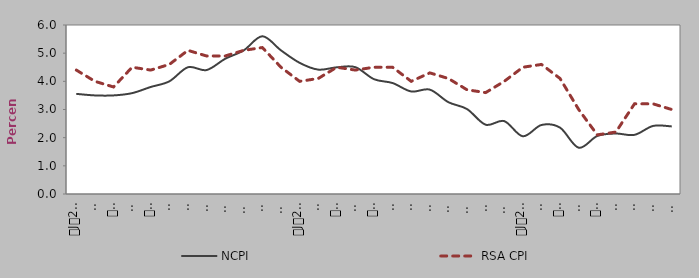
| Category | NCPI | RSA CPI |
|---|---|---|
| 0 | 3.555 | 4.4 |
| 1900-01-01 | 3.5 | 4 |
| 1900-01-02 | 3.5 | 3.8 |
| 1900-01-03 | 3.581 | 4.5 |
| 1900-01-04 | 3.8 | 4.4 |
| 1900-01-05 | 4 | 4.6 |
| 1900-01-06 | 4.5 | 5.1 |
| 1900-01-07 | 4.4 | 4.9 |
| 1900-01-08 | 4.8 | 4.9 |
| 1900-01-09 | 5.1 | 5.1 |
| 1900-01-10 | 5.6 | 5.2 |
| 1900-01-11 | 5.1 | 4.5 |
| 1900-01-12 | 4.658 | 4 |
| 1900-01-13 | 4.416 | 4.1 |
| 1900-01-14 | 4.498 | 4.5 |
| 1900-01-15 | 4.503 | 4.4 |
| 1900-01-16 | 4.076 | 4.5 |
| 1900-01-17 | 3.939 | 4.5 |
| 1900-01-18 | 3.639 | 4 |
| 1900-01-19 | 3.705 | 4.3 |
| 1900-01-20 | 3.259 | 4.1 |
| 1900-01-21 | 3.015 | 3.7 |
| 1900-01-22 | 2.461 | 3.6 |
| 1900-01-23 | 2.588 | 4 |
| 1900-01-24 | 2.05 | 4.5 |
| 1900-01-25 | 2.45 | 4.6 |
| 1900-01-26 | 2.354 | 4.1 |
| 1900-01-27 | 1.643 | 3 |
| 1900-01-28 | 2.06 | 2.1 |
| 1900-01-29 | 2.147 | 2.2 |
| 1900-01-30 | 2.1 | 3.2 |
| 1900-01-31 | 2.416 | 3.2 |
| 1900-02-01 | 2.4 | 3 |